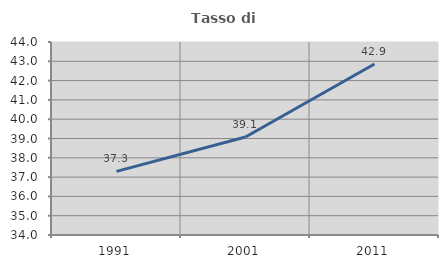
| Category | Tasso di occupazione   |
|---|---|
| 1991.0 | 37.295 |
| 2001.0 | 39.08 |
| 2011.0 | 42.857 |